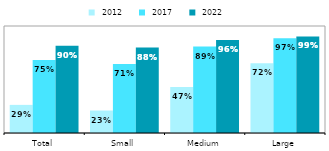
| Category |  2012 |  2017 |  2022 |
|---|---|---|---|
| Total | 0.289 | 0.751 | 0.896 |
| Small | 0.231 | 0.71 | 0.878 |
| Medium | 0.474 | 0.889 | 0.957 |
| Large | 0.716 | 0.973 | 0.993 |